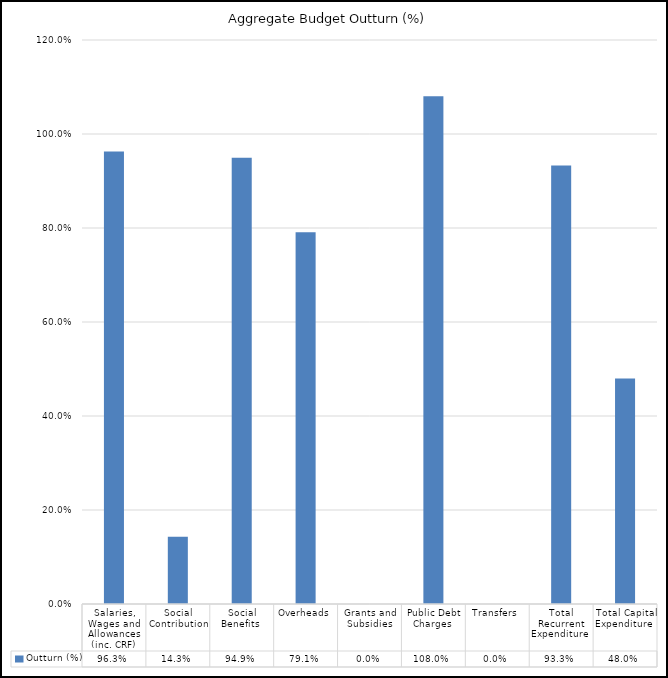
| Category | Outturn (%) |
|---|---|
| Salaries, Wages and Allowances (inc. CRF) | 0.963 |
| Social Contribution | 0.143 |
| Social Benefits  | 0.949 |
| Overheads | 0.791 |
| Grants and Subsidies | 0 |
| Public Debt Charges  | 1.08 |
| Transfers  | 0 |
| Total Recurrent Expenditure  | 0.933 |
| Total Capital Expenditure  | 0.48 |